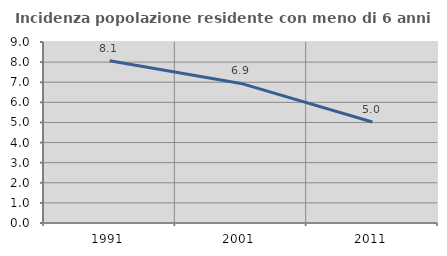
| Category | Incidenza popolazione residente con meno di 6 anni |
|---|---|
| 1991.0 | 8.065 |
| 2001.0 | 6.94 |
| 2011.0 | 5.024 |